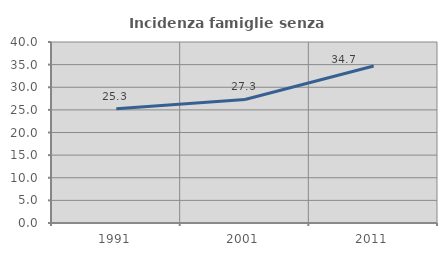
| Category | Incidenza famiglie senza nuclei |
|---|---|
| 1991.0 | 25.275 |
| 2001.0 | 27.309 |
| 2011.0 | 34.689 |